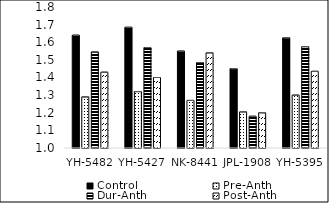
| Category | Control | Pre-Anth | Dur-Anth | Post-Anth |
|---|---|---|---|---|
| YH-5482 | 1.64 | 1.29 | 1.545 | 1.43 |
| YH-5427 | 1.685 | 1.32 | 1.57 | 1.4 |
| NK-8441 | 1.55 | 1.27 | 1.485 | 1.54 |
| JPL-1908 | 1.45 | 1.205 | 1.18 | 1.2 |
| YH-5395 | 1.625 | 1.3 | 1.575 | 1.435 |